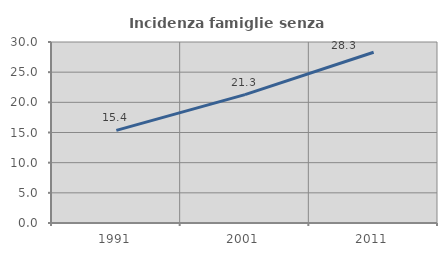
| Category | Incidenza famiglie senza nuclei |
|---|---|
| 1991.0 | 15.356 |
| 2001.0 | 21.284 |
| 2011.0 | 28.308 |